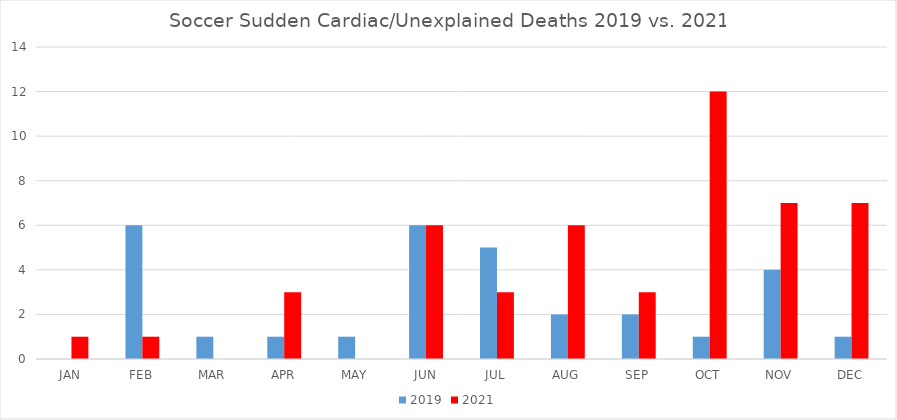
| Category | 2019 | 2021 |
|---|---|---|
| JAN | 0 | 1 |
| FEB | 6 | 1 |
| MAR | 1 | 0 |
| APR | 1 | 3 |
| MAY | 1 | 0 |
| JUN | 6 | 6 |
| JUL | 5 | 3 |
| AUG | 2 | 6 |
| SEP | 2 | 3 |
| OCT | 1 | 12 |
| NOV | 4 | 7 |
| DEC | 1 | 7 |